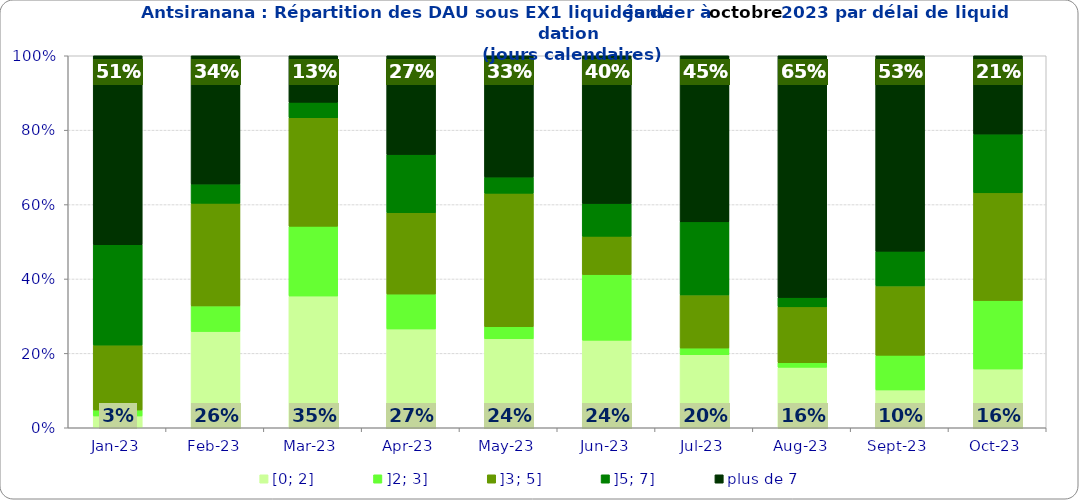
| Category | [0; 2] | ]2; 3] | ]3; 5] | ]5; 7] | plus de 7 |
|---|---|---|---|---|---|
| 2023-01-01 | 0.032 | 0.016 | 0.175 | 0.27 | 0.508 |
| 2023-02-01 | 0.259 | 0.069 | 0.276 | 0.052 | 0.345 |
| 2023-03-01 | 0.354 | 0.188 | 0.292 | 0.042 | 0.125 |
| 2023-04-01 | 0.266 | 0.094 | 0.219 | 0.156 | 0.266 |
| 2023-05-01 | 0.239 | 0.033 | 0.359 | 0.043 | 0.326 |
| 2023-06-01 | 0.235 | 0.176 | 0.103 | 0.088 | 0.397 |
| 2023-07-01 | 0.196 | 0.018 | 0.143 | 0.196 | 0.446 |
| 2023-08-01 | 0.162 | 0.012 | 0.15 | 0.025 | 0.65 |
| 2023-09-01 | 0.102 | 0.093 | 0.186 | 0.093 | 0.525 |
| 2023-10-01 | 0.158 | 0.184 | 0.289 | 0.158 | 0.211 |